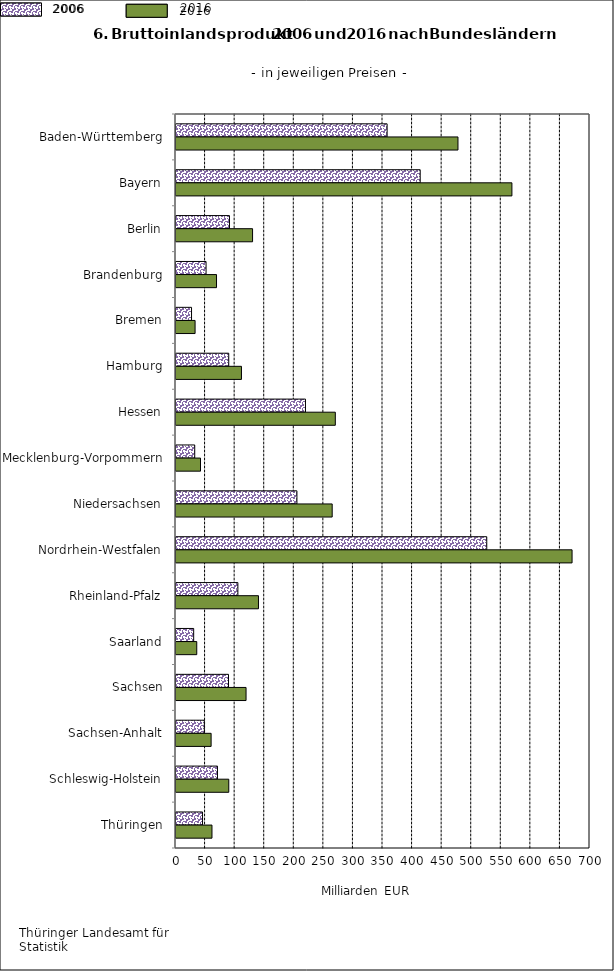
| Category | Series 3 | Series 4 |
|---|---|---|
| Baden-Württemberg | 356.956 | 476.76 |
| Bayern | 412.903 | 567.972 |
| Berlin | 90.412 | 129.454 |
| Brandenburg | 50.82 | 68.508 |
| Bremen | 26.285 | 32.259 |
| Hamburg | 89.173 | 110.674 |
| Hessen | 218.924 | 269.39 |
| Mecklenburg-Vorpommern | 31.67 | 41.429 |
| Niedersachsen | 204.466 | 264.087 |
| Nordrhein-Westfalen | 525.442 | 669.676 |
| Rheinland-Pfalz | 104.636 | 139.452 |
| Saarland | 29.896 | 35.103 |
| Sachsen | 88.779 | 118.457 |
| Sachsen-Anhalt | 47.899 | 59.378 |
| Schleswig-Holstein | 70.119 | 89.227 |
| Thüringen | 44.869 | 60.843 |